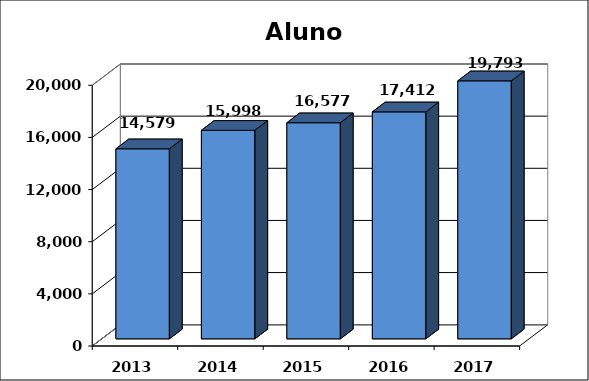
| Category | Series 0 |
|---|---|
| 2013.0 | 14579 |
| 2014.0 | 15998 |
| 2015.0 | 16576.5 |
| 2016.0 | 17412 |
| 2017.0 | 19793 |